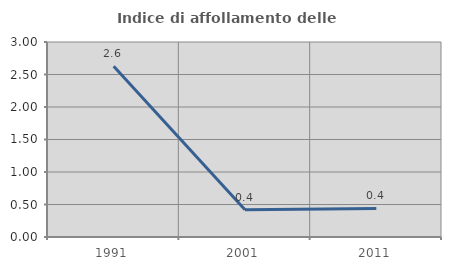
| Category | Indice di affollamento delle abitazioni  |
|---|---|
| 1991.0 | 2.627 |
| 2001.0 | 0.419 |
| 2011.0 | 0.439 |